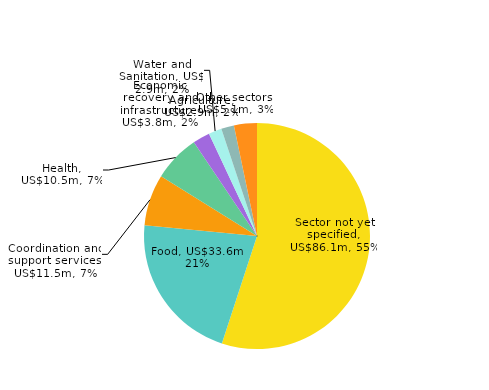
| Category | Series 0 |
|---|---|
| Sector not yet specified, US$86.1m, 55% | 86.06 |
| Food, US$33.6m, 21% | 33.607 |
| Coordination and support services, US$11.5m, 7% | 11.472 |
| Health, US$10.5m, 7% | 10.486 |
| Economic recovery and infrastructure, US$3.8m, 2% | 3.839 |
| Water and Sanitation, US$ 2.9m, 2% | 2.925 |
| Agriculture, US$2.9m, 2% | 2.865 |
| Other sectors, US$5.1m, 3% | 5.127 |